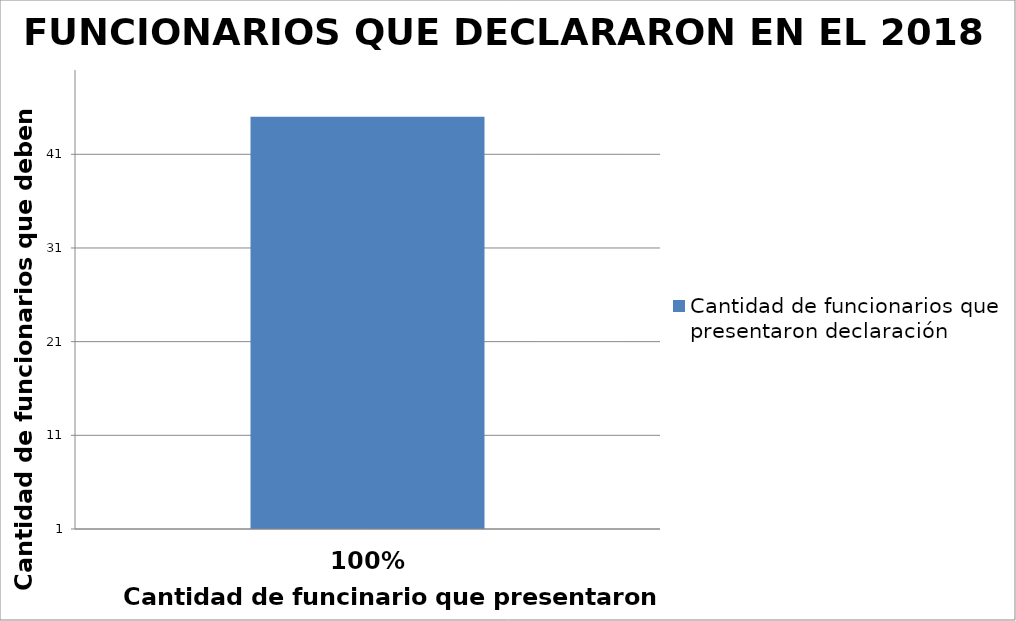
| Category | Cantidad de funcionarios que presentaron declaración |
|---|---|
| 0 | 45 |